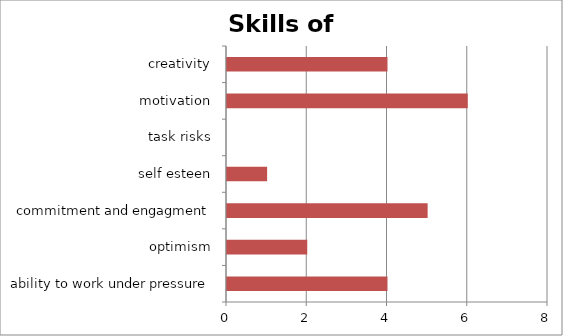
| Category | Skills of companies |
|---|---|
| ability to work under pressure | 4 |
| optimism | 2 |
| commitment and engagment | 5 |
| self esteen | 1 |
| task risks | 0 |
| motivation | 6 |
| creativity | 4 |